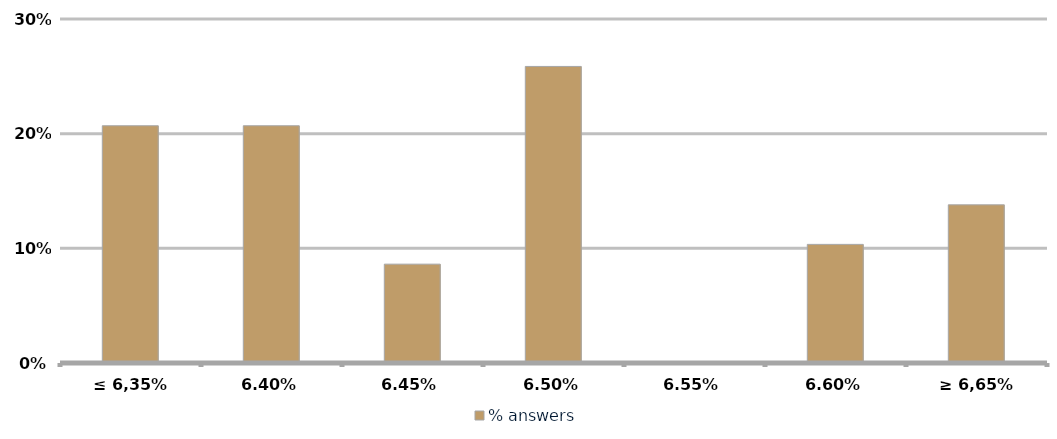
| Category | % answers |
|---|---|
| ≤ 6,35% | 0.207 |
| 6,40% | 0.207 |
| 6,45% | 0.086 |
| 6,50% | 0.259 |
| 6,55% | 0 |
| 6,60% | 0.103 |
| ≥ 6,65% | 0.138 |